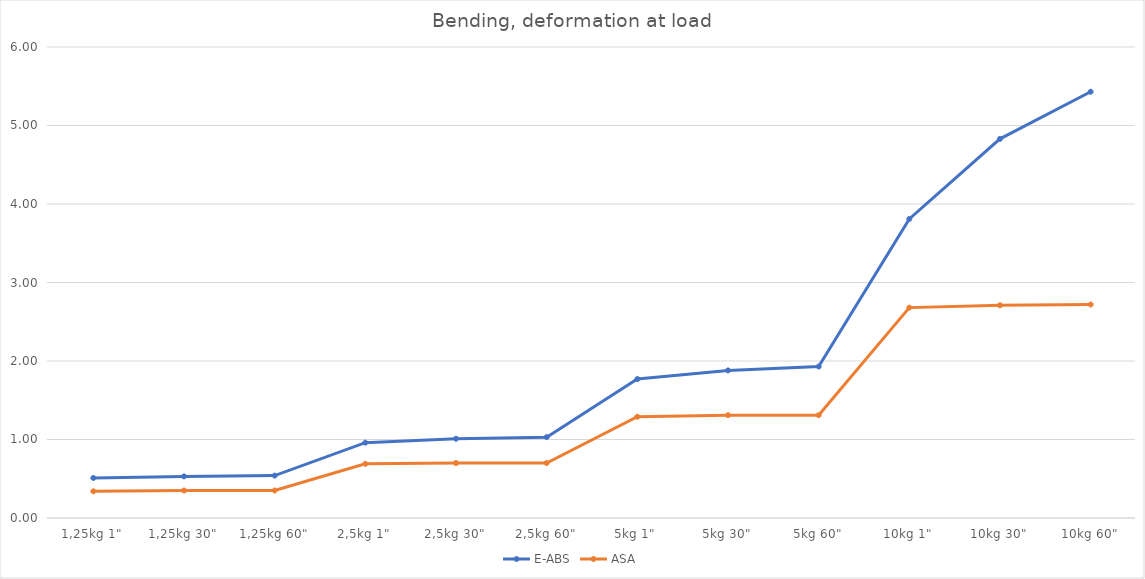
| Category | E-ABS | ASA |
|---|---|---|
| 1,25kg 1" | 0.51 | 0.34 |
| 1,25kg 30" | 0.53 | 0.35 |
| 1,25kg 60" | 0.54 | 0.35 |
| 2,5kg 1" | 0.96 | 0.69 |
| 2,5kg 30" | 1.01 | 0.7 |
| 2,5kg 60" | 1.03 | 0.7 |
| 5kg 1" | 1.77 | 1.29 |
| 5kg 30" | 1.88 | 1.31 |
| 5kg 60" | 1.93 | 1.31 |
| 10kg 1" | 3.81 | 2.68 |
| 10kg 30" | 4.83 | 2.71 |
| 10kg 60" | 5.43 | 2.72 |